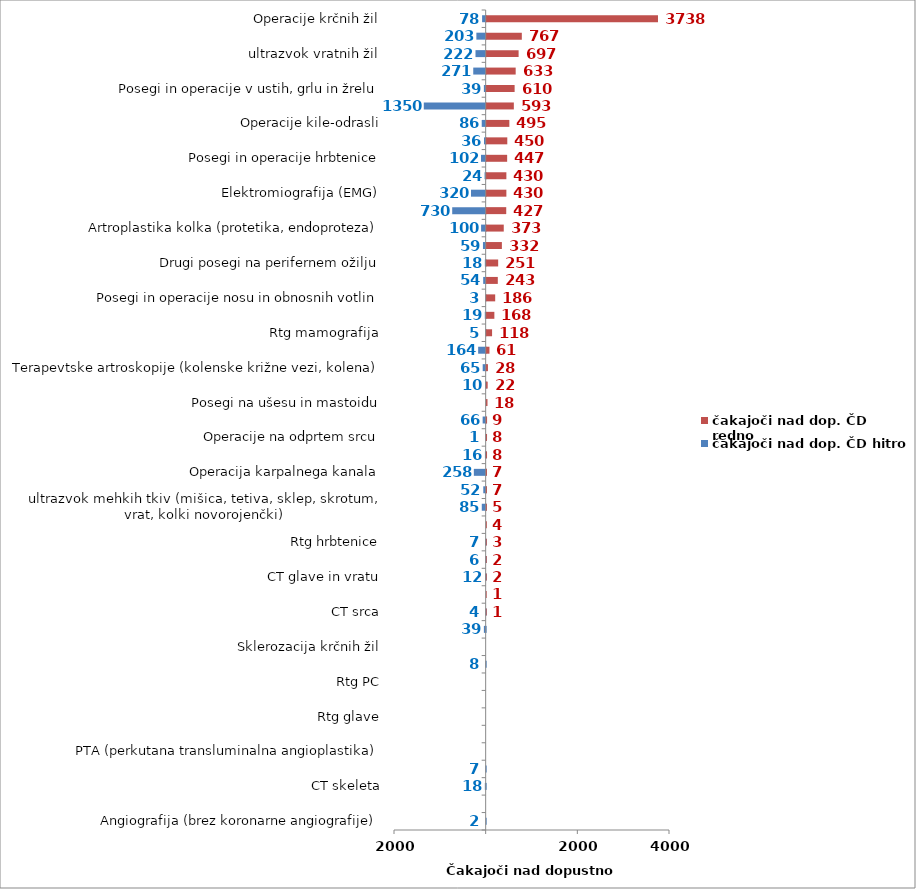
| Category | čakajoči nad dop. ČD hitro | čakajoči nad dop. ČD redno |
|---|---|---|
| Angiografija (brez koronarne angiografije) | -2 | 0 |
| Artroplastika gležnja | 0 | 0 |
| CT skeleta | -18 | 0 |
| Elektroencefalografija (EEG) | -7 | 0 |
| PTA (perkutana transluminalna angioplastika) | 0 | 0 |
| Rtg abdomna | 0 | 0 |
| Rtg glave | 0 | 0 |
| Rtg ledvic in sečnega mehurja | 0 | 0 |
| Rtg PC | 0 | 0 |
| Rtg skletela | -8 | 0 |
| Sklerozacija krčnih žil | 0 | 0 |
| ultrazvok rame | -39 | 0 |
| CT srca | -4 | 1 |
| Posegi na arterijah (brez PTA) | 0 | 1 |
| CT glave in vratu | -12 | 2 |
| MR srca | -6 | 2 |
| Rtg hrbtenice | -7 | 3 |
| Operacije kile-otroci | 0 | 4 |
| ultrazvok mehkih tkiv (mišica, tetiva, sklep, skrotum, vrat, kolki novorojenčki) | -85 | 5 |
| MR toraks in abdomen | -52 | 7 |
| Operacija karpalnega kanala | -258 | 7 |
| MR angiografije | -16 | 8 |
| Operacije na odprtem srcu | -1 | 8 |
| CT toraks in abdomen | -66 | 9 |
| Posegi na ušesu in mastoidu | 0 | 18 |
| Operacija ščitnice (tudi obščitnice) | -10 | 22 |
| Terapevtske artroskopije (kolenske križne vezi, kolena) | -65 | 28 |
| CT angiografije | -164 | 61 |
| Rtg mamografija | -5 | 118 |
| Ortopedska operacija rame (samo terapevstki posegi na rami) | -19 | 168 |
| Posegi in operacije nosu in obnosnih votlin | -3 | 186 |
| Operacije žolčnih kamnov | -54 | 243 |
| Drugi posegi na perifernem ožilju | -18 | 251 |
| Operacija sive mrene (katarakta) | -59 | 332 |
| Artroplastika kolka (protetika, endoproteza) | -100 | 373 |
| MR glave in vratu | -730 | 427 |
| Elektromiografija (EMG) | -320 | 430 |
| ultrazvok dojke | -24 | 430 |
| Posegi in operacije hrbtenice | -102 | 447 |
| Artroplastika kolena | -36 | 450 |
| Operacije kile-odrasli | -86 | 495 |
| MR skeleta | -1350 | 593 |
| Posegi in operacije v ustih, grlu in žrelu | -39 | 610 |
| Koronarna angiografija in PTCA | -271 | 633 |
| ultrazvok vratnih žil | -222 | 697 |
| ultrazvok srca | -203 | 767 |
| Operacije krčnih žil | -78 | 3738 |